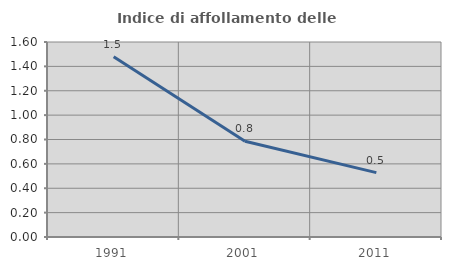
| Category | Indice di affollamento delle abitazioni  |
|---|---|
| 1991.0 | 1.478 |
| 2001.0 | 0.785 |
| 2011.0 | 0.528 |